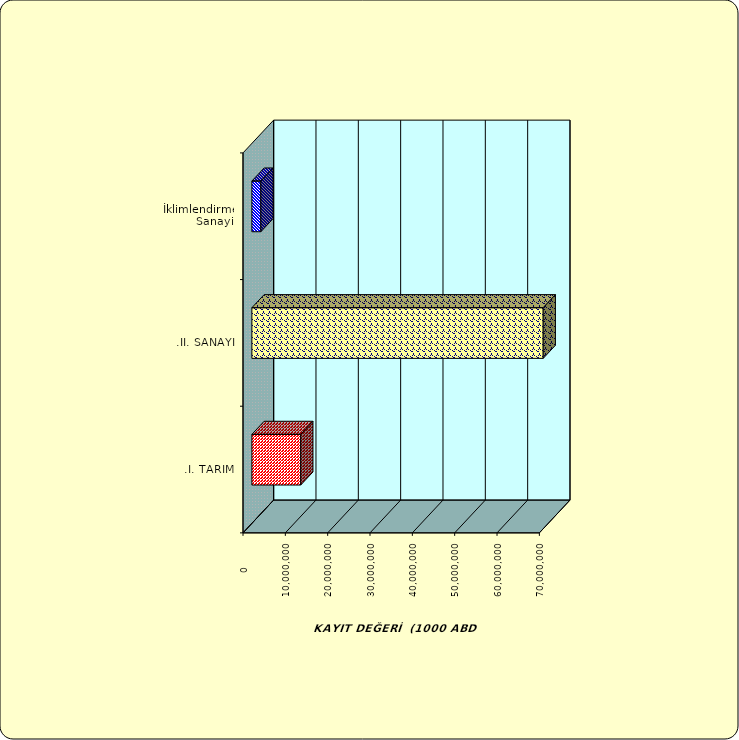
| Category | Series 0 |
|---|---|
| .I. TARIM | 11539415.138 |
| .II. SANAYİ | 68809286.551 |
|  İklimlendirme Sanayii | 2123538.761 |